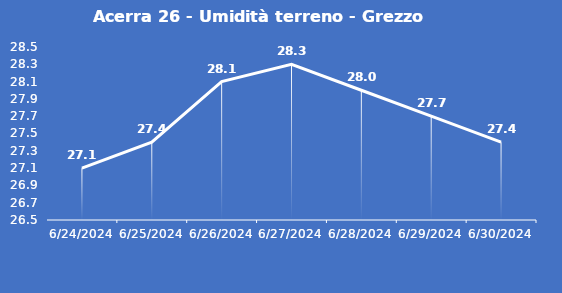
| Category | Acerra 26 - Umidità terreno - Grezzo (%VWC) |
|---|---|
| 6/24/24 | 27.1 |
| 6/25/24 | 27.4 |
| 6/26/24 | 28.1 |
| 6/27/24 | 28.3 |
| 6/28/24 | 28 |
| 6/29/24 | 27.7 |
| 6/30/24 | 27.4 |